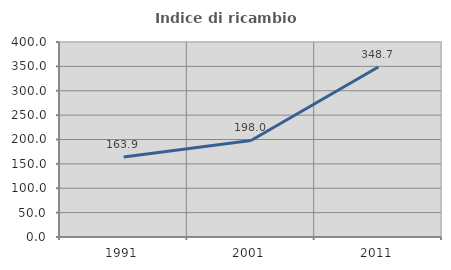
| Category | Indice di ricambio occupazionale  |
|---|---|
| 1991.0 | 163.934 |
| 2001.0 | 198 |
| 2011.0 | 348.718 |